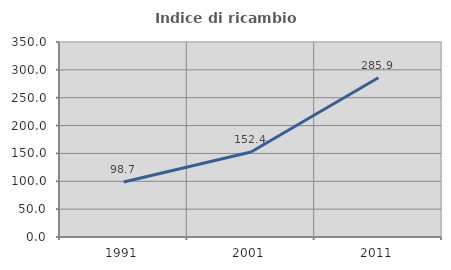
| Category | Indice di ricambio occupazionale  |
|---|---|
| 1991.0 | 98.677 |
| 2001.0 | 152.443 |
| 2011.0 | 285.864 |